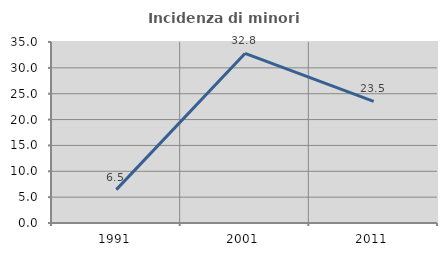
| Category | Incidenza di minori stranieri |
|---|---|
| 1991.0 | 6.452 |
| 2001.0 | 32.787 |
| 2011.0 | 23.529 |